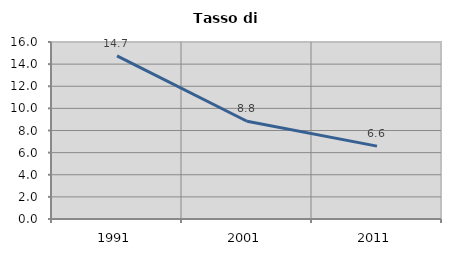
| Category | Tasso di disoccupazione   |
|---|---|
| 1991.0 | 14.747 |
| 2001.0 | 8.833 |
| 2011.0 | 6.587 |